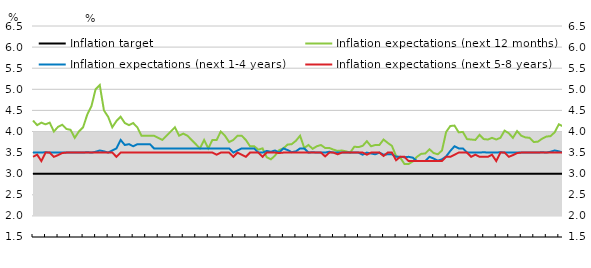
| Category | Inflation target | Inflation expectations (next 12 months) | Inflation expectations (next 1-4 years) | Inflation expectations (next 5-8 years) |
|---|---|---|---|---|
| nan | 3 | 4.26 | 3.5 | 3.4 |
| nan | 3 | 4.15 | 3.5 | 3.45 |
| nan | 3 | 4.21 | 3.5 | 3.3 |
| nan | 3 | 4.17 | 3.51 | 3.5 |
| nan | 3 | 4.21 | 3.5 | 3.5 |
| 2009.0 | 3 | 4 | 3.5 | 3.4 |
| nan | 3 | 4.11 | 3.5 | 3.44 |
| nan | 3 | 4.16 | 3.5 | 3.49 |
| nan | 3 | 4.06 | 3.5 | 3.5 |
| nan | 3 | 4.04 | 3.5 | 3.5 |
| nan | 3 | 3.85 | 3.5 | 3.5 |
| nan | 3 | 4 | 3.5 | 3.5 |
| nan | 3 | 4.1 | 3.5 | 3.5 |
| nan | 3 | 4.4 | 3.51 | 3.5 |
| nan | 3 | 4.6 | 3.5 | 3.5 |
| nan | 3 | 5 | 3.52 | 3.5 |
| nan | 3 | 5.1 | 3.55 | 3.5 |
| 2010.0 | 3 | 4.5 | 3.53 | 3.5 |
| nan | 3 | 4.35 | 3.5 | 3.5 |
| nan | 3 | 4.1 | 3.55 | 3.5 |
| nan | 3 | 4.25 | 3.6 | 3.4 |
| nan | 3 | 4.35 | 3.8 | 3.5 |
| nan | 3 | 4.2 | 3.68 | 3.5 |
| nan | 3 | 4.15 | 3.7 | 3.5 |
| nan | 3 | 4.2 | 3.65 | 3.5 |
| nan | 3 | 4.1 | 3.7 | 3.5 |
| nan | 3 | 3.9 | 3.7 | 3.5 |
| nan | 3 | 3.9 | 3.7 | 3.5 |
| nan | 3 | 3.9 | 3.7 | 3.5 |
| 2011.0 | 3 | 3.9 | 3.6 | 3.5 |
| nan | 3 | 3.85 | 3.6 | 3.5 |
| nan | 3 | 3.8 | 3.6 | 3.5 |
| nan | 3 | 3.9 | 3.6 | 3.5 |
| nan | 3 | 4 | 3.6 | 3.5 |
| nan | 3 | 4.1 | 3.6 | 3.5 |
| nan | 3 | 3.9 | 3.6 | 3.5 |
| nan | 3 | 3.95 | 3.6 | 3.5 |
| nan | 3 | 3.9 | 3.6 | 3.5 |
| nan | 3 | 3.8 | 3.6 | 3.5 |
| nan | 3 | 3.7 | 3.6 | 3.5 |
| nan | 3 | 3.6 | 3.6 | 3.5 |
| 2012.0 | 3 | 3.8 | 3.6 | 3.5 |
| nan | 3 | 3.6 | 3.6 | 3.5 |
| nan | 3 | 3.8 | 3.6 | 3.5 |
| nan | 3 | 3.8 | 3.6 | 3.45 |
| nan | 3 | 4 | 3.6 | 3.5 |
| nan | 3 | 3.9 | 3.6 | 3.5 |
| nan | 3 | 3.75 | 3.6 | 3.5 |
| nan | 3 | 3.8 | 3.5 | 3.4 |
| nan | 3 | 3.9 | 3.55 | 3.5 |
| nan | 3 | 3.9 | 3.6 | 3.45 |
| nan | 3 | 3.8 | 3.6 | 3.4 |
| nan | 3 | 3.65 | 3.6 | 3.5 |
| 2013.0 | 3 | 3.65 | 3.6 | 3.5 |
| nan | 3 | 3.57 | 3.5 | 3.5 |
| nan | 3 | 3.6 | 3.5 | 3.4 |
| nan | 3 | 3.39 | 3.54 | 3.5 |
| nan | 3 | 3.34 | 3.52 | 3.5 |
| nan | 3 | 3.43 | 3.55 | 3.5 |
| nan | 3 | 3.56 | 3.5 | 3.49 |
| nan | 3 | 3.6 | 3.6 | 3.5 |
| nan | 3 | 3.69 | 3.56 | 3.5 |
| nan | 3 | 3.7 | 3.51 | 3.5 |
| nan | 3 | 3.78 | 3.53 | 3.5 |
| nan | 3 | 3.9 | 3.6 | 3.5 |
| 2014.0 | 3 | 3.61 | 3.6 | 3.5 |
| nan | 3 | 3.68 | 3.5 | 3.5 |
| nan | 3 | 3.59 | 3.51 | 3.5 |
| nan | 3 | 3.65 | 3.5 | 3.5 |
| nan | 3 | 3.68 | 3.5 | 3.5 |
| nan | 3 | 3.61 | 3.5 | 3.41 |
| nan | 3 | 3.61 | 3.52 | 3.5 |
| nan | 3 | 3.57 | 3.5 | 3.5 |
| nan | 3 | 3.54 | 3.5 | 3.46 |
| nan | 3 | 3.55 | 3.5 | 3.5 |
| nan | 3 | 3.53 | 3.5 | 3.5 |
| nan | 3 | 3.5 | 3.5 | 3.5 |
| 2015.0 | 3 | 3.64 | 3.5 | 3.5 |
| nan | 3 | 3.63 | 3.5 | 3.5 |
| nan | 3 | 3.66 | 3.45 | 3.5 |
| nan | 3 | 3.77 | 3.5 | 3.45 |
| nan | 3 | 3.65 | 3.48 | 3.5 |
| nan | 3 | 3.68 | 3.46 | 3.5 |
| nan | 3 | 3.68 | 3.5 | 3.5 |
| nan | 3 | 3.81 | 3.45 | 3.42 |
| nan | 3 | 3.73 | 3.46 | 3.5 |
| nan | 3 | 3.66 | 3.46 | 3.5 |
| nan | 3 | 3.42 | 3.4 | 3.32 |
| nan | 3 | 3.38 | 3.4 | 3.4 |
| 2016.0 | 3 | 3.23 | 3.39 | 3.4 |
| nan | 3 | 3.23 | 3.4 | 3.3 |
| nan | 3 | 3.29 | 3.38 | 3.3 |
| nan | 3 | 3.4 | 3.3 | 3.3 |
| nan | 3 | 3.47 | 3.3 | 3.3 |
| nan | 3 | 3.48 | 3.3 | 3.3 |
| nan | 3 | 3.58 | 3.4 | 3.3 |
| nan | 3 | 3.49 | 3.36 | 3.3 |
| nan | 3 | 3.46 | 3.31 | 3.3 |
| nan | 3 | 3.55 | 3.34 | 3.3 |
| nan | 3 | 3.99 | 3.41 | 3.4 |
| nan | 3 | 4.13 | 3.54 | 3.4 |
| 2017.0 | 3 | 4.14 | 3.65 | 3.45 |
| nan | 3 | 3.98 | 3.6 | 3.5 |
| nan | 3 | 3.99 | 3.6 | 3.5 |
| nan | 3 | 3.82 | 3.5 | 3.5 |
| nan | 3 | 3.81 | 3.5 | 3.4 |
| nan | 3 | 3.8 | 3.5 | 3.45 |
| nan | 3 | 3.92 | 3.5 | 3.4 |
| nan | 3 | 3.82 | 3.51 | 3.4 |
| nan | 3 | 3.81 | 3.5 | 3.4 |
| nan | 3 | 3.85 | 3.5 | 3.45 |
| nan | 3 | 3.81 | 3.5 | 3.3 |
| nan | 3 | 3.85 | 3.51 | 3.5 |
| 2018.0 | 3 | 4.02 | 3.5 | 3.5 |
| nan | 3 | 3.96 | 3.5 | 3.4 |
| nan | 3 | 3.85 | 3.5 | 3.44 |
| nan | 3 | 4.01 | 3.5 | 3.49 |
| nan | 3 | 3.9 | 3.5 | 3.5 |
| nan | 3 | 3.86 | 3.5 | 3.5 |
| nan | 3 | 3.85 | 3.5 | 3.5 |
| nan | 3 | 3.75 | 3.5 | 3.5 |
| nan | 3 | 3.76 | 3.5 | 3.5 |
| nan | 3 | 3.83 | 3.51 | 3.5 |
| nan | 3 | 3.88 | 3.5 | 3.5 |
| nan | 3 | 3.89 | 3.52 | 3.5 |
| 2019.0 | 3 | 3.98 | 3.55 | 3.5 |
| nan | 3 | 4.17 | 3.53 | 3.5 |
| nan | 3 | 4.12 | 3.5 | 3.5 |